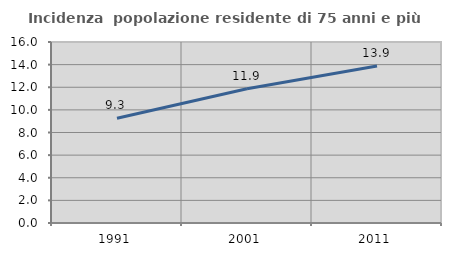
| Category | Incidenza  popolazione residente di 75 anni e più |
|---|---|
| 1991.0 | 9.261 |
| 2001.0 | 11.871 |
| 2011.0 | 13.87 |